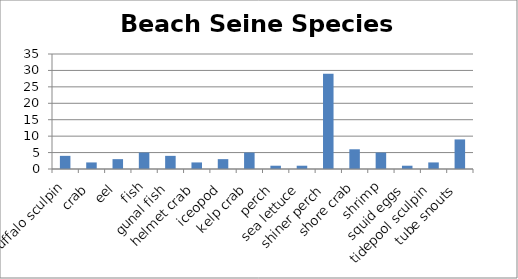
| Category | Total |
|---|---|
| buffalo sculpin | 4 |
| crab | 2 |
| eel | 3 |
| fish | 5 |
| gunal fish | 4 |
| helmet crab | 2 |
| iceopod | 3 |
| kelp crab | 5 |
| perch | 1 |
| sea lettuce | 1 |
| shiner perch | 29 |
| shore crab | 6 |
| shrimp | 5 |
| squid eggs | 1 |
| tidepool sculpin | 2 |
| tube snouts | 9 |